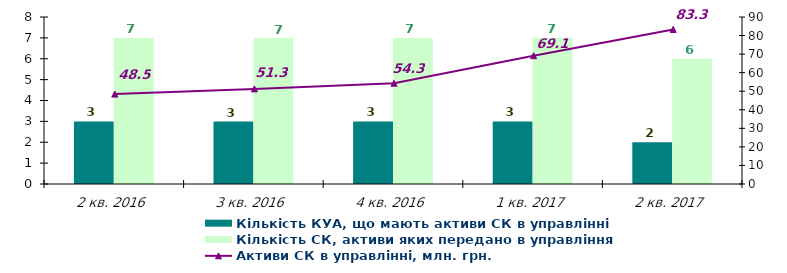
| Category | Кількість КУА, що мають активи СК в управлінні | Кількість СК, активи яких передано в управління |
|---|---|---|
| 2 кв. 2016 | 3 | 7 |
| 3 кв. 2016 | 3 | 7 |
| 4 кв. 2016 | 3 | 7 |
| 1 кв. 2017 | 3 | 7 |
| 2 кв. 2017 | 2 | 6 |